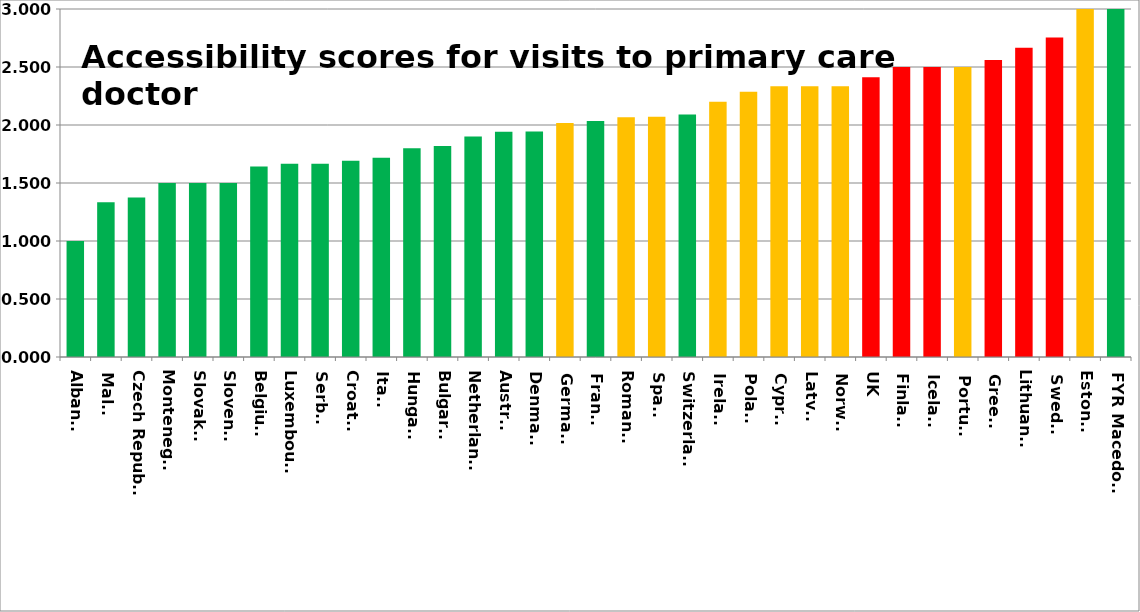
| Category | Series 0 |
|---|---|
| Albania | 1 |
| Malta | 1.333 |
| Czech Republic | 1.375 |
| Montenegro | 1.5 |
| Slovakia | 1.5 |
| Slovenia | 1.5 |
| Belgium | 1.643 |
| Luxembourg | 1.667 |
| Serbia | 1.667 |
| Croatia | 1.692 |
| Italy | 1.718 |
| Hungary | 1.8 |
| Bulgaria | 1.818 |
| Netherlands | 1.9 |
| Austria | 1.941 |
| Denmark | 1.944 |
| Germany | 2.017 |
| France | 2.034 |
| Romania | 2.067 |
| Spain | 2.071 |
| Switzerland | 2.091 |
| Ireland | 2.2 |
| Poland | 2.286 |
| Cyprus | 2.333 |
| Latvia | 2.333 |
| Norway | 2.333 |
| UK | 2.412 |
| Finland | 2.5 |
| Iceland | 2.5 |
| Portugal | 2.5 |
| Greece | 2.56 |
| Lithuania | 2.667 |
| Sweden | 2.755 |
| Estonia | 3 |
| FYR Macedonia | 3 |